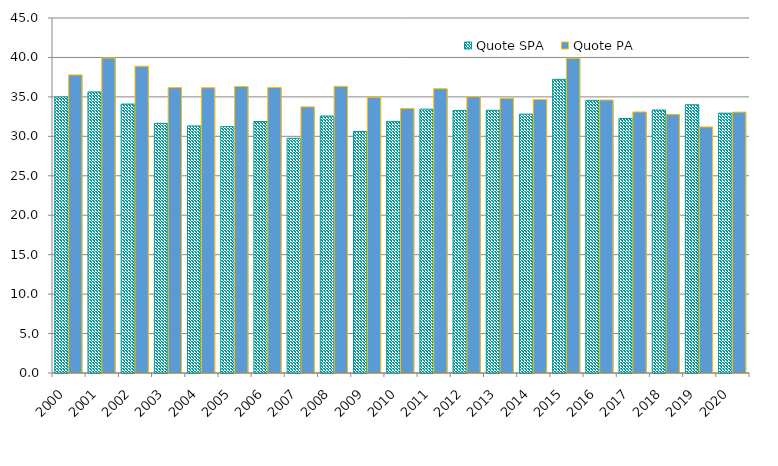
| Category | Quote SPA | Quote PA |
|---|---|---|
| 2000 | 34.991 | 37.786 |
| 2001 | 35.632 | 39.929 |
| 2002 | 34.091 | 38.893 |
| 2003 | 31.647 | 36.178 |
| 2004 | 31.318 | 36.166 |
| 2005 | 31.232 | 36.314 |
| 2006 | 31.875 | 36.205 |
| 2007 | 29.754 | 33.735 |
| 2008 | 32.574 | 36.333 |
| 2009 | 30.621 | 34.952 |
| 2010 | 31.896 | 33.539 |
| 2011 | 33.446 | 36.038 |
| 2012 | 33.282 | 35.022 |
| 2013 | 33.303 | 34.815 |
| 2014 | 32.813 | 34.659 |
| 2015 | 37.225 | 39.901 |
| 2016 | 34.557 | 34.61 |
| 2017 | 32.259 | 33.096 |
| 2018 | 33.333 | 32.784 |
| 2019 | 34 | 31.196 |
| 2020 | 32.936 | 33.069 |